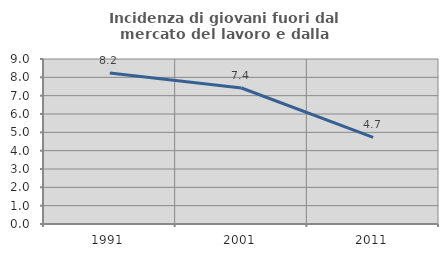
| Category | Incidenza di giovani fuori dal mercato del lavoro e dalla formazione  |
|---|---|
| 1991.0 | 8.242 |
| 2001.0 | 7.419 |
| 2011.0 | 4.727 |